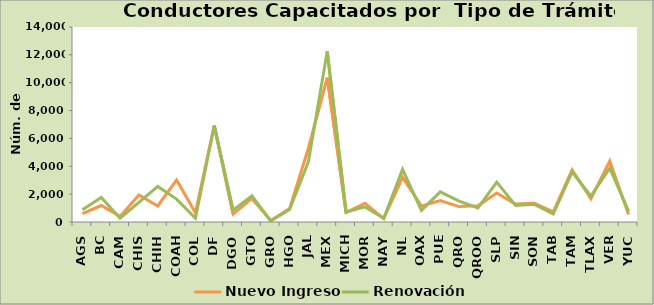
| Category | Nuevo Ingreso | Renovación |
|---|---|---|
| AGS | 594 | 875 |
| BC | 1182 | 1760 |
| CAM | 401 | 272 |
| CHIS | 1940 | 1415 |
| CHIH | 1152 | 2557 |
| COAH | 3021 | 1644 |
| COL | 665 | 268 |
| DF | 6950 | 6893 |
| DGO | 570 | 843 |
| GTO | 1692 | 1874 |
| GRO | 109 | 71 |
| HGO | 960 | 901 |
| JAL | 5297 | 4328 |
| MEX | 10366 | 12254 |
| MICH | 676 | 714 |
| MOR | 1349 | 1083 |
| NAY | 240 | 272 |
| NL | 3198 | 3773 |
| OAX | 1142 | 833 |
| PUE | 1536 | 2159 |
| QRO | 1108 | 1499 |
| QROO | 1161 | 1006 |
| SLP | 2087 | 2863 |
| SIN | 1284 | 1183 |
| SON | 1342 | 1268 |
| TAB | 735 | 570 |
| TAM | 3746 | 3579 |
| TLAX | 1666 | 1866 |
| VER | 4373 | 3869 |
| YUC | 535 | 768 |